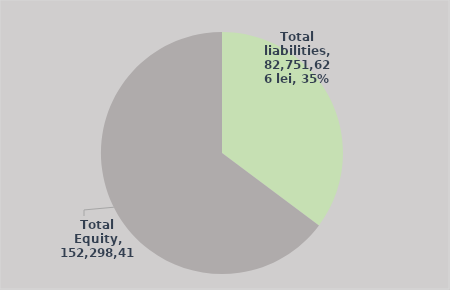
| Category | Series 0 |
|---|---|
| Total liabilities | 82751626 |
| Total Equity | 152298411 |